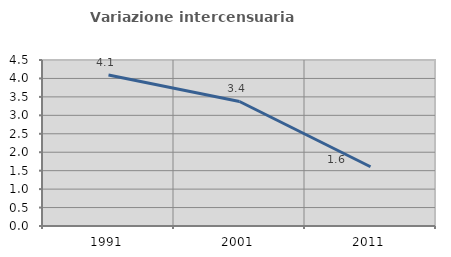
| Category | Variazione intercensuaria annua |
|---|---|
| 1991.0 | 4.095 |
| 2001.0 | 3.376 |
| 2011.0 | 1.607 |